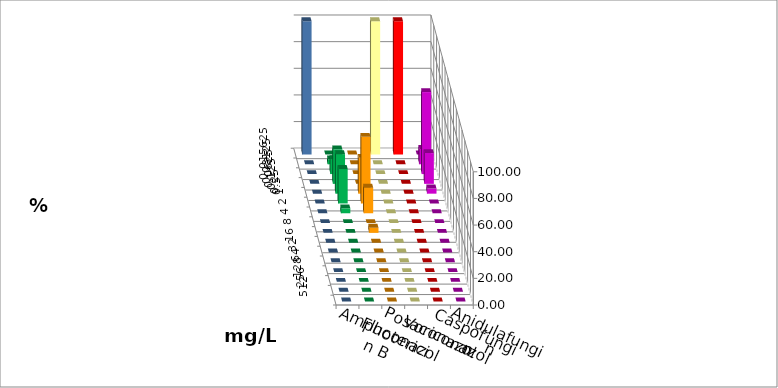
| Category | Amphotericin B | Fluconazol | Posaconazol | Voriconazol | Caspofungin | Anidulafungin |
|---|---|---|---|---|---|---|
| 0.015625 | 0 | 0 | 100 | 100 | 0 | 100 |
| 0.03125 | 3.704 | 0 | 0 | 0 | 11.538 | 0 |
| 0.0625 | 11.111 | 0 | 0 | 0 | 61.538 | 0 |
| 0.125 | 25.926 | 0 | 0 | 0 | 23.077 | 0 |
| 0.25 | 29.63 | 26.923 | 0 | 0 | 3.846 | 0 |
| 0.5 | 25.926 | 50 | 0 | 0 | 0 | 0 |
| 1.0 | 3.704 | 19.231 | 0 | 0 | 0 | 0 |
| 2.0 | 0 | 0 | 0 | 0 | 0 | 0 |
| 4.0 | 0 | 3.846 | 0 | 0 | 0 | 0 |
| 8.0 | 0 | 0 | 0 | 0 | 0 | 0 |
| 16.0 | 0 | 0 | 0 | 0 | 0 | 0 |
| 32.0 | 0 | 0 | 0 | 0 | 0 | 0 |
| 64.0 | 0 | 0 | 0 | 0 | 0 | 0 |
| 128.0 | 0 | 0 | 0 | 0 | 0 | 0 |
| 256.0 | 0 | 0 | 0 | 0 | 0 | 0 |
| 512.0 | 0 | 0 | 0 | 0 | 0 | 0 |